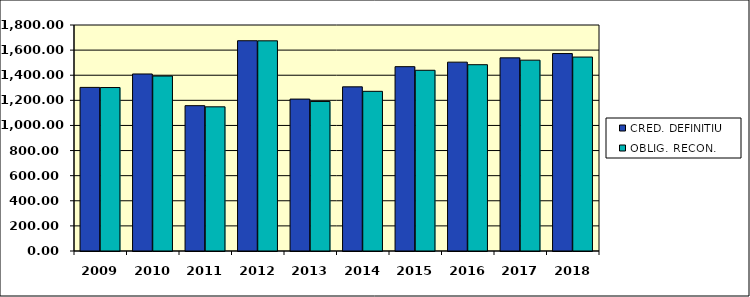
| Category | CRED. DEFINITIU | OBLIG. RECON. |
|---|---|---|
| 2009.0 | 1303.06 | 1301.96 |
| 2010.0 | 1409.87 | 1393.53 |
| 2011.0 | 1157.53 | 1148.3 |
| 2012.0 | 1674.76 | 1673.95 |
| 2013.0 | 1209.96 | 1190.97 |
| 2014.0 | 1307.45 | 1271.74 |
| 2015.0 | 1468.11 | 1439.42 |
| 2016.0 | 1504.11 | 1483.88 |
| 2017.0 | 1538.35 | 1519.94 |
| 2018.0 | 1572.53 | 1544.74 |